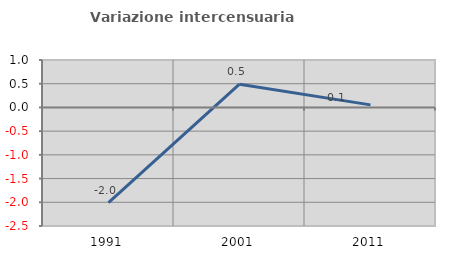
| Category | Variazione intercensuaria annua |
|---|---|
| 1991.0 | -2.008 |
| 2001.0 | 0.489 |
| 2011.0 | 0.054 |